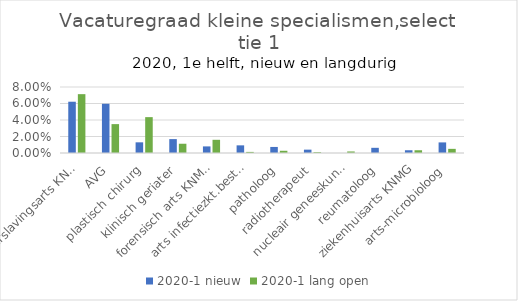
| Category | 2020-1 |
|---|---|
| verslavingsarts KNMG | 0.071 |
| AVG | 0.035 |
| plastisch chirurg | 0.043 |
| klinisch geriater | 0.011 |
| forensisch arts KNMG | 0.016 |
| arts infectiezkt.bestr. KNMG | 0.001 |
| patholoog | 0.003 |
| radiotherapeut | 0.001 |
| nucleair geneeskundige | 0.002 |
| reumatoloog | 0 |
| ziekenhuisarts KNMG | 0.003 |
| arts-microbioloog | 0.005 |